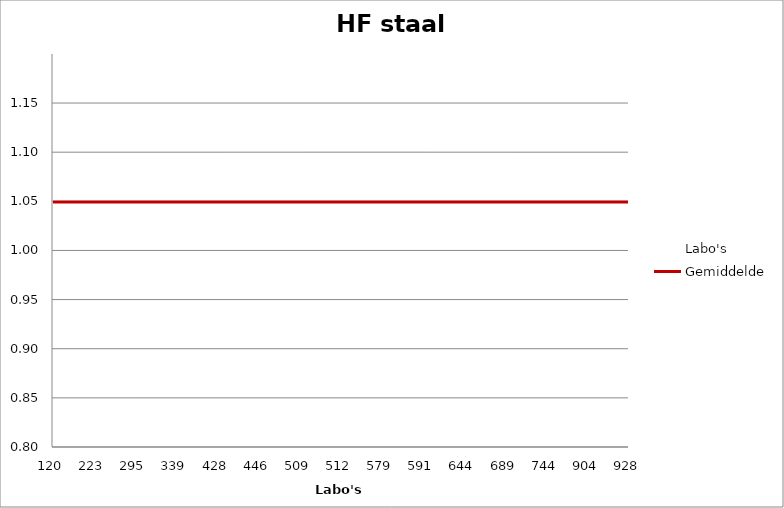
| Category | Labo's | Gemiddelde |
|---|---|---|
| 120.0 | 1.08 | 1.049 |
| 223.0 | 1.01 | 1.049 |
| 295.0 | 1.02 | 1.049 |
| 339.0 | 0.97 | 1.049 |
| 428.0 | 1.16 | 1.049 |
| 446.0 | 1.08 | 1.049 |
| 509.0 | 1.05 | 1.049 |
| 512.0 | 0.86 | 1.049 |
| 579.0 | 1.03 | 1.049 |
| 591.0 | 1.08 | 1.049 |
| 644.0 | 1.1 | 1.049 |
| 689.0 | 1.05 | 1.049 |
| 744.0 | 0.99 | 1.049 |
| 904.0 | 1.12 | 1.049 |
| 928.0 | 1.06 | 1.049 |